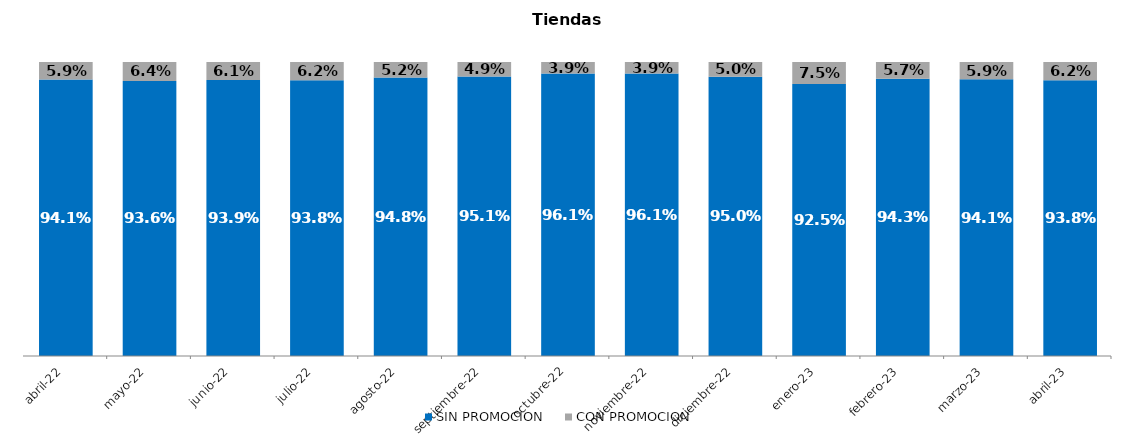
| Category | SIN PROMOCION   | CON PROMOCION   |
|---|---|---|
| 2022-04-01 | 0.941 | 0.059 |
| 2022-05-01 | 0.936 | 0.064 |
| 2022-06-01 | 0.939 | 0.061 |
| 2022-07-01 | 0.938 | 0.062 |
| 2022-08-01 | 0.948 | 0.052 |
| 2022-09-01 | 0.951 | 0.049 |
| 2022-10-01 | 0.961 | 0.039 |
| 2022-11-01 | 0.961 | 0.039 |
| 2022-12-01 | 0.95 | 0.05 |
| 2023-01-01 | 0.925 | 0.075 |
| 2023-02-01 | 0.943 | 0.057 |
| 2023-03-01 | 0.941 | 0.059 |
| 2023-04-01 | 0.938 | 0.062 |